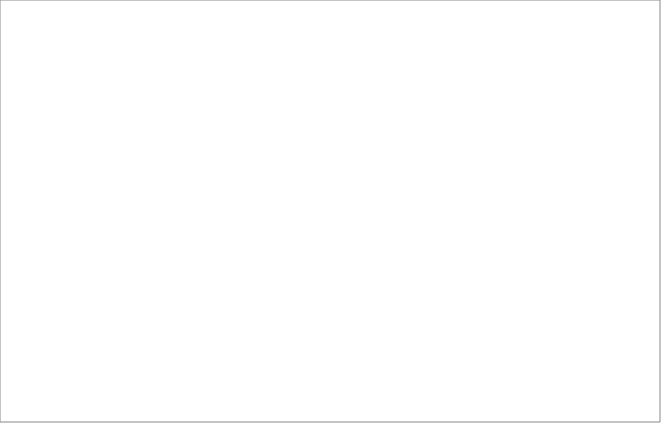
| Category | الاستهلاك الوسيط  | الانتــاج | القيمة المضافة  |
|---|---|---|---|
| Total | 52846182.972 | 147744848.624 | 94898665.652 |